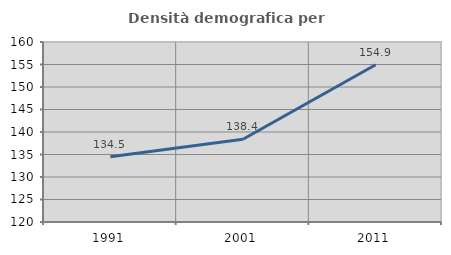
| Category | Densità demografica |
|---|---|
| 1991.0 | 134.513 |
| 2001.0 | 138.377 |
| 2011.0 | 154.942 |